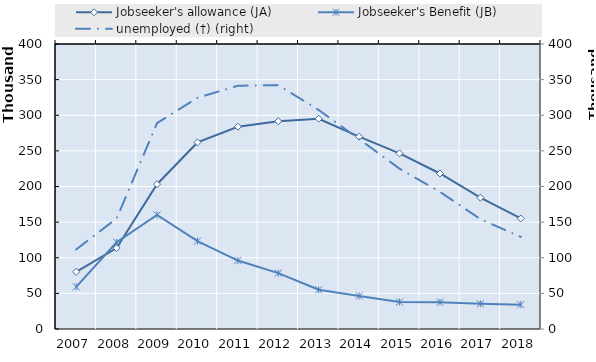
| Category | Series 5 | Series 6 | Series 7 | Series 8 | Series 9 | Series 10 | Series 11 | Series 12 | Series 13 | Series 14 | Series 15 | Series 16 | Series 17 | Series 18 | Series 19 | Jobseeker's allowance (JA) | Jobseeker's Benefit (JB) |
|---|---|---|---|---|---|---|---|---|---|---|---|---|---|---|---|---|---|
| 2007.0 |  |  |  |  |  |  |  |  |  |  |  |  |  |  |  | 80268 | 59167 |
| 2008.0 |  |  |  |  |  |  |  |  |  |  |  |  |  |  |  | 113603 | 121763 |
| 2009.0 |  |  |  |  |  |  |  |  |  |  |  |  |  |  |  | 203248 | 160122 |
| 2010.0 |  |  |  |  |  |  |  |  |  |  |  |  |  |  |  | 261850 | 123457 |
| 2011.0 |  |  |  |  |  |  |  |  |  |  |  |  |  |  |  | 283929 | 96044 |
| 2012.0 |  |  |  |  |  |  |  |  |  |  |  |  |  |  |  | 291640 | 78459 |
| 2013.0 |  |  |  |  |  |  |  |  |  |  |  |  |  |  |  | 295077 | 55068 |
| 2014.0 |  |  |  |  |  |  |  |  |  |  |  |  |  |  |  | 269951 | 46335 |
| 2015.0 |  |  |  |  |  |  |  |  |  |  |  |  |  |  |  | 246536 | 37845 |
| 2016.0 |  |  |  |  |  |  |  |  |  |  |  |  |  |  |  | 218260 | 37625 |
| 2017.0 |  |  |  |  |  |  |  |  |  |  |  |  |  |  |  | 184310 | 35463 |
| 2018.0 |  |  |  |  |  |  |  |  |  |  |  |  |  |  |  | 155133 | 34189 |